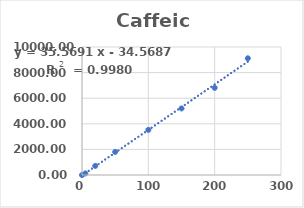
| Category | Area |
|---|---|
| 0.0 | 0 |
| 5.0 | 120.373 |
| 20.0 | 710.815 |
| 50.0 | 1804.717 |
| 100.0 | 3526.408 |
| 150.0 | 5199.597 |
| 200.0 | 6809.054 |
| 250.0 | 9118.503 |